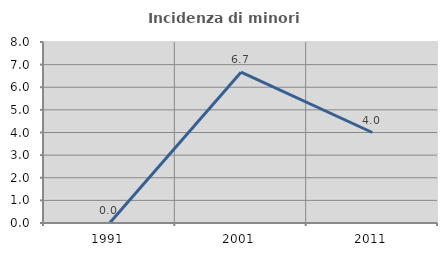
| Category | Incidenza di minori stranieri |
|---|---|
| 1991.0 | 0 |
| 2001.0 | 6.667 |
| 2011.0 | 4 |